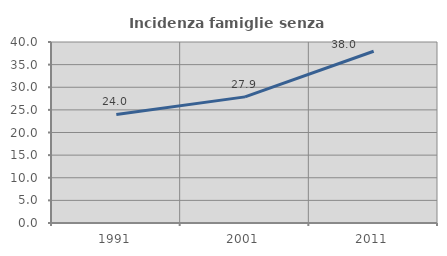
| Category | Incidenza famiglie senza nuclei |
|---|---|
| 1991.0 | 23.995 |
| 2001.0 | 27.873 |
| 2011.0 | 37.957 |